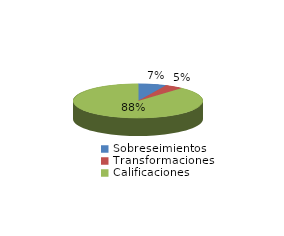
| Category | Series 0 |
|---|---|
| Sobreseimientos | 46 |
| Transformaciones | 30 |
| Calificaciones | 581 |